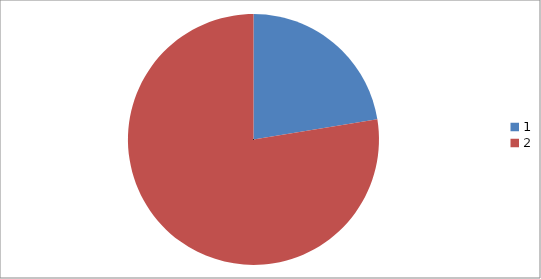
| Category | Series 0 |
|---|---|
| 0 | 159 |
| 1 | 550 |